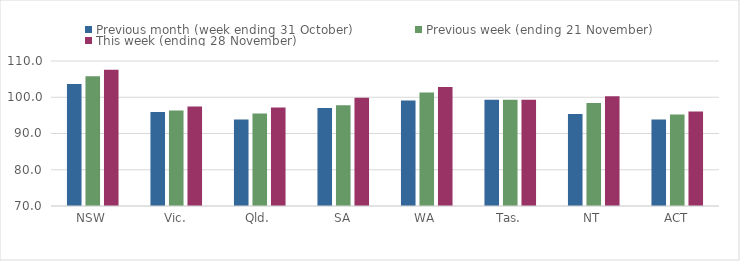
| Category | Previous month (week ending 31 October) | Previous week (ending 21 November) | This week (ending 28 November) |
|---|---|---|---|
| NSW | 103.64 | 105.76 | 107.61 |
| Vic. | 95.92 | 96.35 | 97.48 |
| Qld. | 93.86 | 95.52 | 97.15 |
| SA | 97.04 | 97.78 | 99.84 |
| WA | 99.09 | 101.28 | 102.86 |
| Tas. | 99.28 | 99.28 | 99.28 |
| NT | 95.37 | 98.43 | 100.3 |
| ACT | 93.86 | 95.24 | 96.06 |